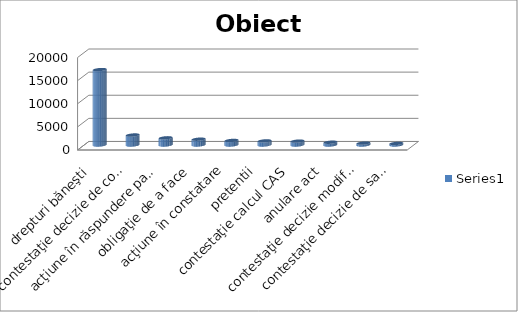
| Category | Series 0 |
|---|---|
| drepturi băneşti  | 16311 |
| contestaţie decizie de concediere | 2160 |
| acţiune în răspundere patrimonială | 1551 |
| obligaţie de a face | 1258 |
| acţiune în constatare | 986 |
| pretentii | 887 |
| contestaţie calcul CAS | 837 |
| anulare act | 600 |
| contestaţie decizie modificare unilaterală contract de muncă | 402 |
| contestaţie decizie de sancţionare | 338 |